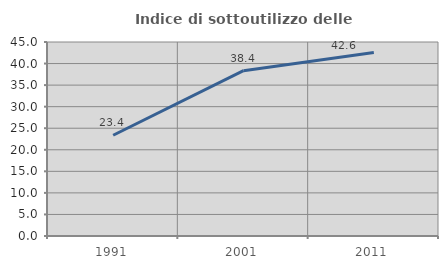
| Category | Indice di sottoutilizzo delle abitazioni  |
|---|---|
| 1991.0 | 23.368 |
| 2001.0 | 38.356 |
| 2011.0 | 42.564 |